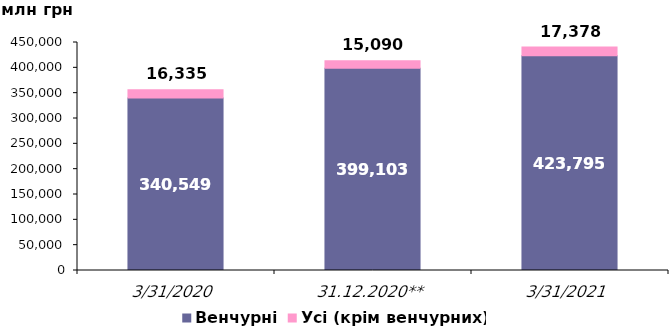
| Category | Венчурні | Усі (крім венчурних) |
|---|---|---|
| 31.03.2020 | 340549.472 | 16334.801 |
| 31.12.2020** | 399103.175 | 15089.679 |
| 31.03.2021 | 423794.786 | 17377.523 |